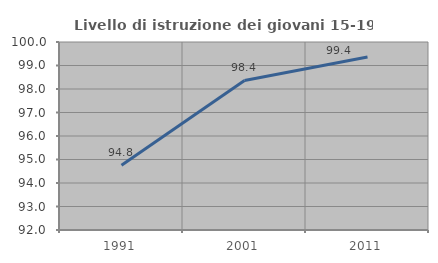
| Category | Livello di istruzione dei giovani 15-19 anni |
|---|---|
| 1991.0 | 94.757 |
| 2001.0 | 98.363 |
| 2011.0 | 99.358 |